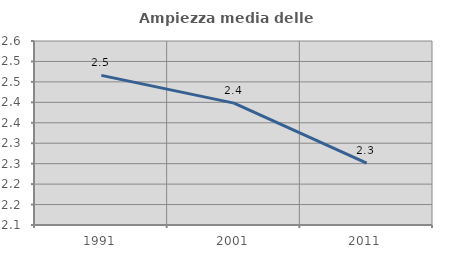
| Category | Ampiezza media delle famiglie |
|---|---|
| 1991.0 | 2.466 |
| 2001.0 | 2.398 |
| 2011.0 | 2.251 |